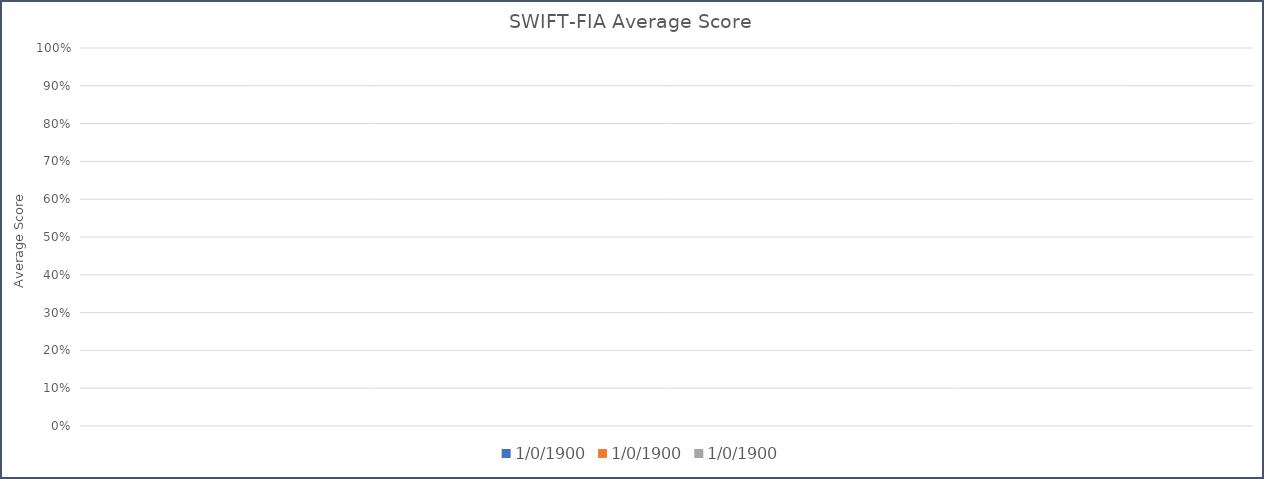
| Category | 1/0/00 |
|---|---|
| Average Score | 0 |